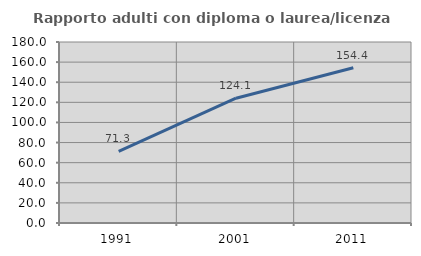
| Category | Rapporto adulti con diploma o laurea/licenza media  |
|---|---|
| 1991.0 | 71.318 |
| 2001.0 | 124.083 |
| 2011.0 | 154.382 |